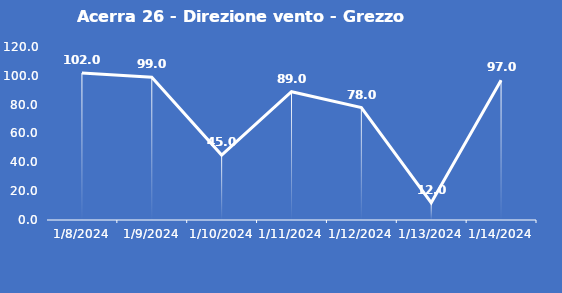
| Category | Acerra 26 - Direzione vento - Grezzo (°N) |
|---|---|
| 1/8/24 | 102 |
| 1/9/24 | 99 |
| 1/10/24 | 45 |
| 1/11/24 | 89 |
| 1/12/24 | 78 |
| 1/13/24 | 12 |
| 1/14/24 | 97 |